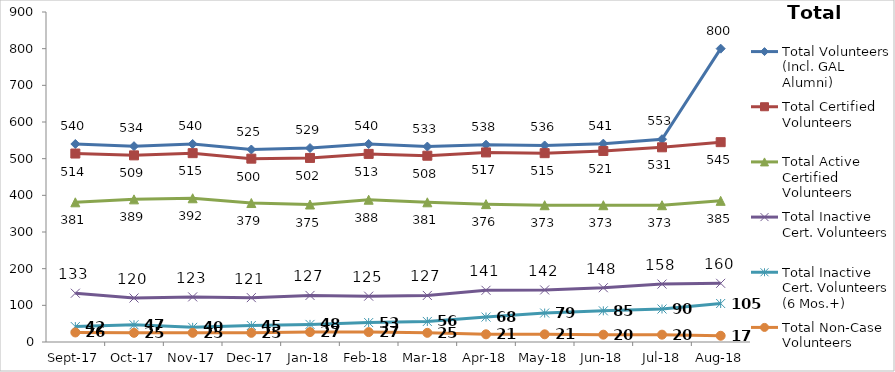
| Category | Total Volunteers (Incl. GAL Alumni) | Total Certified Volunteers | Total Active Certified Volunteers | Total Inactive Cert. Volunteers | Total Inactive Cert. Volunteers (6 Mos.+) | Total Non-Case Volunteers |
|---|---|---|---|---|---|---|
| 2017-09-01 | 540 | 514 | 381 | 133 | 42 | 26 |
| 2017-10-01 | 534 | 509 | 389 | 120 | 47 | 25 |
| 2017-11-01 | 540 | 515 | 392 | 123 | 40 | 25 |
| 2017-12-01 | 525 | 500 | 379 | 121 | 45 | 25 |
| 2018-01-01 | 529 | 502 | 375 | 127 | 48 | 27 |
| 2018-02-01 | 540 | 513 | 388 | 125 | 53 | 27 |
| 2018-03-01 | 533 | 508 | 381 | 127 | 56 | 25 |
| 2018-04-01 | 538 | 517 | 376 | 141 | 68 | 21 |
| 2018-05-01 | 536 | 515 | 373 | 142 | 79 | 21 |
| 2018-06-01 | 541 | 521 | 373 | 148 | 85 | 20 |
| 2018-07-01 | 553 | 531 | 373 | 158 | 90 | 20 |
| 2018-08-01 | 800 | 545 | 385 | 160 | 105 | 17 |